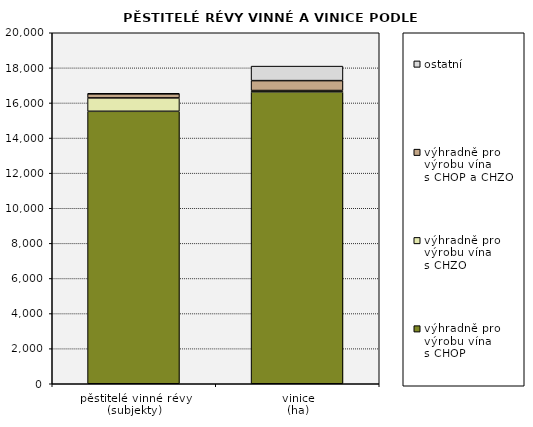
| Category | výhradně pro
výrobu vína
s CHOP | výhradně pro
výrobu vína
s CHZO | výhradně pro
výrobu vína
s CHOP a CHZO | ostatní |
|---|---|---|---|---|
| pěstitelé vinné révy
(subjekty) | 15525 | 762 | 236 | 18 |
| vinice
(ha) | 16630.04 | 78.214 | 564.238 | 826.873 |